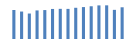
| Category | Exportações (1) |
|---|---|
| 0 | 392293.987 |
| 1 | 370979.678 |
| 2 | 344221.998 |
| 3 | 386156.652 |
| 4 | 390987.572 |
| 5 | 406063.094 |
| 6 | 407598.054 |
| 7 | 406953.169 |
| 8 | 421887.391 |
| 9 | 431264.801 |
| 10 | 442364.452 |
| 11 | 454202.095 |
| 12 | 454929.952 |
| 13 | 393954.142 |
| 14 | 428598.711 |